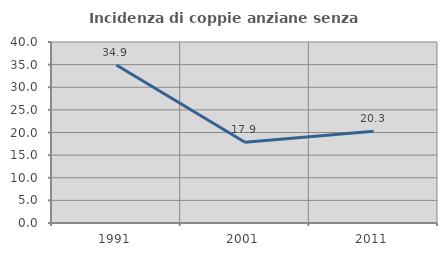
| Category | Incidenza di coppie anziane senza figli  |
|---|---|
| 1991.0 | 34.921 |
| 2001.0 | 17.857 |
| 2011.0 | 20.29 |